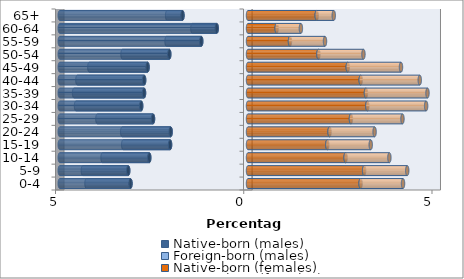
| Category | Native-born (males) | Foreign-born (males) | Native-born (females) | Foreign-born (females) |
|---|---|---|---|---|
| 0-4 | -3.121 | -1.169 | 2.991 | 1.127 |
| 5-9 | -3.181 | -1.205 | 3.085 | 1.145 |
| 10-14 | -2.622 | -1.242 | 2.592 | 1.163 |
| 15-19 | -2.07 | -1.245 | 2.106 | 1.154 |
| 20-24 | -2.054 | -1.287 | 2.166 | 1.196 |
| 25-29 | -2.523 | -1.477 | 2.734 | 1.369 |
| 30-34 | -2.837 | -1.731 | 3.169 | 1.562 |
| 35-39 | -2.761 | -1.858 | 3.133 | 1.634 |
| 40-44 | -2.758 | -1.773 | 2.994 | 1.568 |
| 45-49 | -2.668 | -1.547 | 2.65 | 1.414 |
| 50-54 | -2.091 | -1.242 | 1.87 | 1.196 |
| 55-59 | -1.242 | -0.921 | 1.115 | 0.931 |
| 60-64 | -0.831 | -0.647 | 0.761 | 0.644 |
| 65+ | -1.74 | -0.408 | 1.825 | 0.453 |